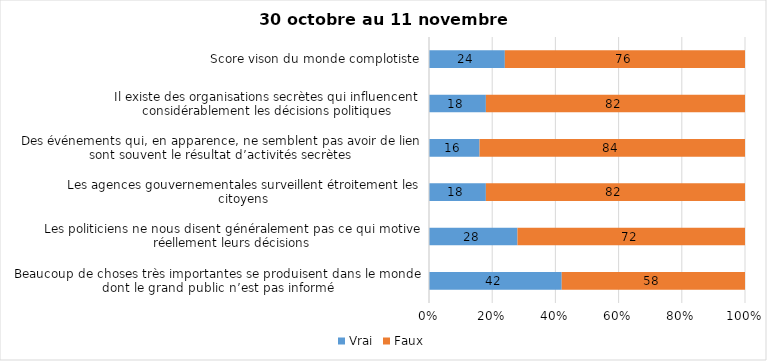
| Category | Vrai | Faux |
|---|---|---|
| Beaucoup de choses très importantes se produisent dans le monde dont le grand public n’est pas informé | 42 | 58 |
| Les politiciens ne nous disent généralement pas ce qui motive réellement leurs décisions | 28 | 72 |
| Les agences gouvernementales surveillent étroitement les citoyens | 18 | 82 |
| Des événements qui, en apparence, ne semblent pas avoir de lien sont souvent le résultat d’activités secrètes | 16 | 84 |
| Il existe des organisations secrètes qui influencent considérablement les décisions politiques | 18 | 82 |
| Score vison du monde complotiste | 24 | 76 |